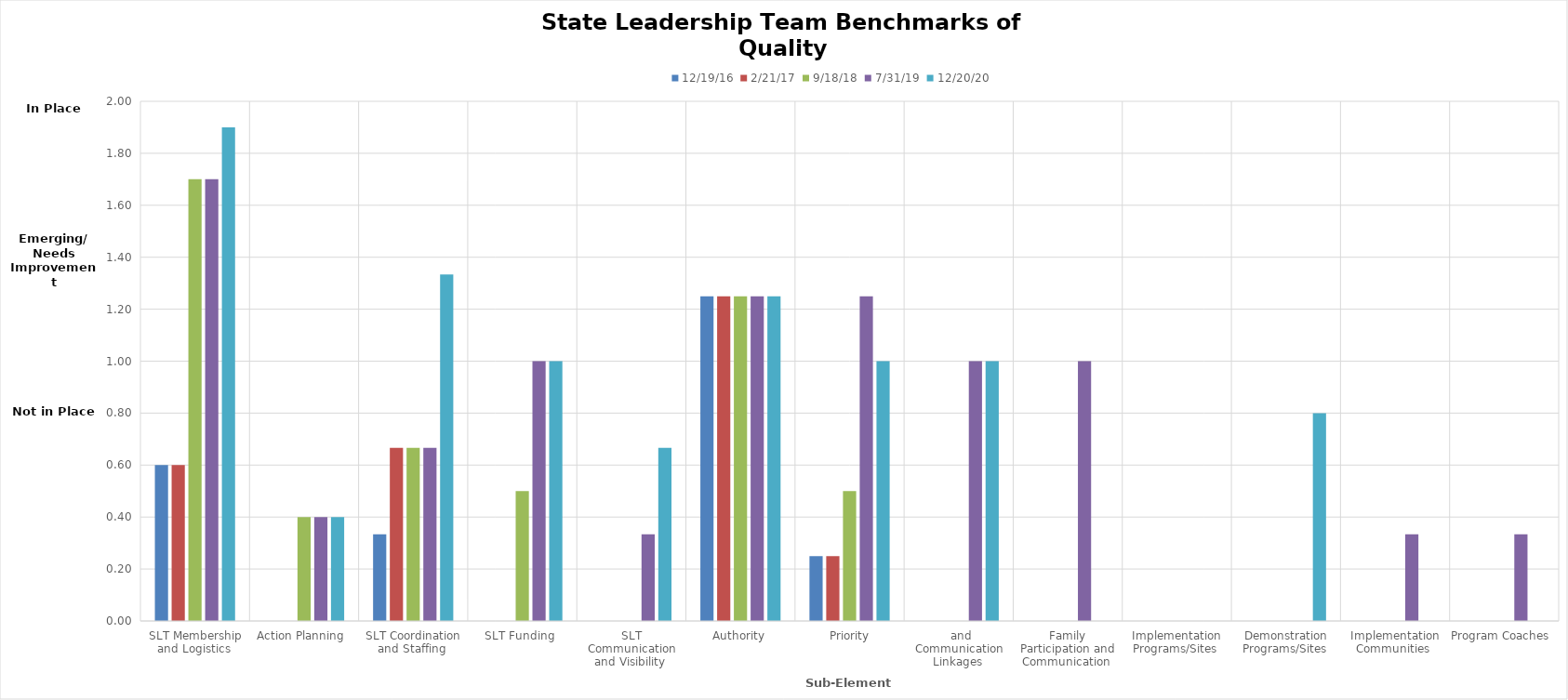
| Category | 12/19/16 | 2/21/17 | 9/18/18 | 7/31/19 | 12/20/20 |
|---|---|---|---|---|---|
| SLT Membership and Logistics  | 0.6 | 0.6 | 1.7 | 1.7 | 1.9 |
| Action Planning  | 0 | 0 | 0.4 | 0.4 | 0.4 |
| SLT Coordination and Staffing  | 0.333 | 0.667 | 0.667 | 0.667 | 1.333 |
| SLT Funding  | 0 | 0 | 0.5 | 1 | 1 |
| SLT Communication and Visibility  | 0 | 0 | 0 | 0.333 | 0.667 |
| Authority, Priority, and Communication Linkages  | 1.25 | 1.25 | 1.25 | 1.25 | 1.25 |
| Family Participation and Communication  | 0.25 | 0.25 | 0.5 | 1.25 | 1 |
| Implementation Programs/Sites  | 0 | 0 | 0 | 1 | 1 |
| Demonstration Programs/Sites  | 0 | 0 | 0 | 1 | 0 |
| Implementation Communities  | 0 | 0 | 0 | 0 | 0 |
| Program Coaches  | 0 | 0 | 0 | 0 | 0.8 |
| Ongoing Support and Technical Assistance  | 0 | 0 | 0 | 0.333 | 0 |
| Data-Based Decision Making  | 0 | 0 | 0 | 0.333 | 0 |